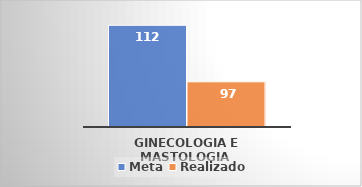
| Category | Meta | Realizado |
|---|---|---|
| Ginecologia e Mastologia  | 112 | 97 |